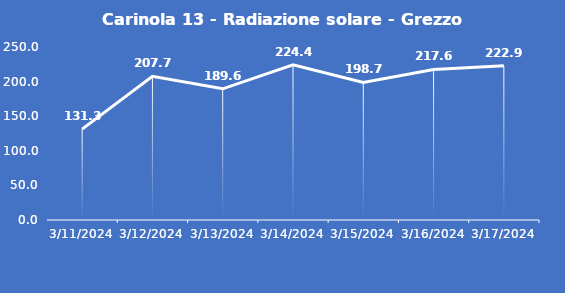
| Category | Carinola 13 - Radiazione solare - Grezzo (W/m2) |
|---|---|
| 3/11/24 | 131.3 |
| 3/12/24 | 207.7 |
| 3/13/24 | 189.6 |
| 3/14/24 | 224.4 |
| 3/15/24 | 198.7 |
| 3/16/24 | 217.6 |
| 3/17/24 | 222.9 |